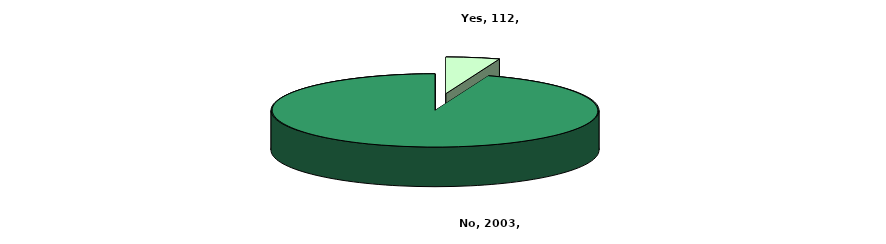
| Category | Series 0 |
|---|---|
| Yes | 112 |
| No | 2003 |